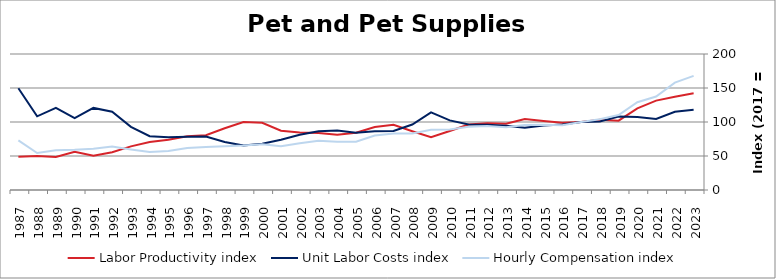
| Category | Labor Productivity index | Unit Labor Costs index | Hourly Compensation index |
|---|---|---|---|
| 2023.0 | 142.298 | 117.964 | 167.86 |
| 2022.0 | 137.226 | 115.052 | 157.882 |
| 2021.0 | 131.414 | 104.577 | 137.429 |
| 2020.0 | 120.144 | 107.502 | 129.158 |
| 2019.0 | 101.958 | 108.187 | 110.306 |
| 2018.0 | 103.169 | 100.773 | 103.966 |
| 2017.0 | 100 | 100 | 100 |
| 2016.0 | 98.839 | 96.376 | 95.257 |
| 2015.0 | 101.387 | 94.749 | 96.063 |
| 2014.0 | 104.415 | 91.63 | 95.676 |
| 2013.0 | 97.416 | 94.622 | 92.177 |
| 2012.0 | 98.152 | 96.026 | 94.252 |
| 2011.0 | 96.368 | 96.363 | 92.863 |
| 2010.0 | 86.851 | 102.331 | 88.876 |
| 2009.0 | 77.667 | 114.043 | 88.574 |
| 2008.0 | 86.406 | 96.242 | 83.159 |
| 2007.0 | 95.78 | 86.872 | 83.205 |
| 2006.0 | 92.64 | 86.439 | 80.077 |
| 2005.0 | 84.197 | 84.25 | 70.936 |
| 2004.0 | 81.286 | 87.359 | 71.011 |
| 2003.0 | 83.858 | 86.26 | 72.336 |
| 2002.0 | 84.494 | 81.213 | 68.62 |
| 2001.0 | 87.267 | 73.92 | 64.508 |
| 2000.0 | 98.875 | 68.101 | 67.334 |
| 1999.0 | 99.939 | 65.429 | 65.389 |
| 1998.0 | 90.792 | 70.713 | 64.202 |
| 1997.0 | 80.471 | 78.704 | 63.333 |
| 1996.0 | 78.899 | 78.226 | 61.72 |
| 1995.0 | 73.876 | 77.546 | 57.288 |
| 1994.0 | 70.672 | 79.177 | 55.956 |
| 1993.0 | 64.148 | 92.971 | 59.639 |
| 1992.0 | 55.488 | 115.124 | 63.88 |
| 1991.0 | 50.347 | 120.701 | 60.769 |
| 1990.0 | 56.145 | 105.676 | 59.332 |
| 1989.0 | 48.536 | 120.674 | 58.57 |
| 1988.0 | 50.141 | 108.396 | 54.35 |
| 1987.0 | 48.856 | 149.603 | 73.09 |